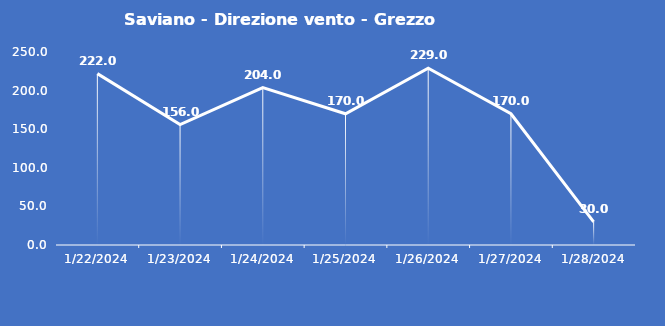
| Category | Saviano - Direzione vento - Grezzo (°N) |
|---|---|
| 1/22/24 | 222 |
| 1/23/24 | 156 |
| 1/24/24 | 204 |
| 1/25/24 | 170 |
| 1/26/24 | 229 |
| 1/27/24 | 170 |
| 1/28/24 | 30 |